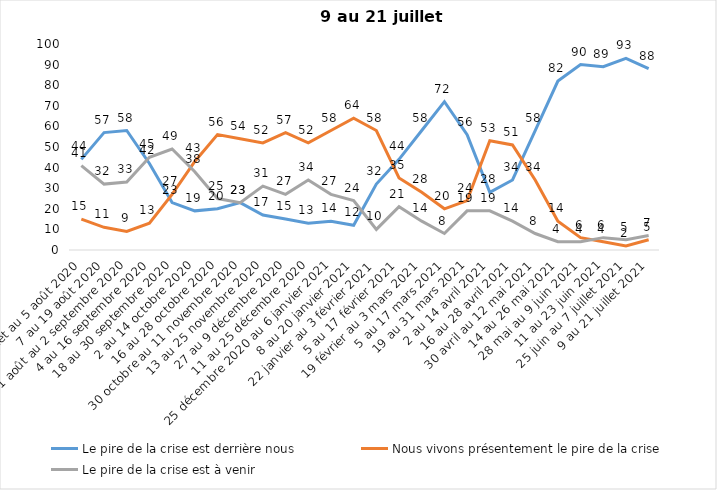
| Category | Le pire de la crise est derrière nous | Nous vivons présentement le pire de la crise | Le pire de la crise est à venir |
|---|---|---|---|
| 24 juillet au 5 août 2020 | 44 | 15 | 41 |
| 7 au 19 août 2020 | 57 | 11 | 32 |
| 21 août au 2 septembre 2020 | 58 | 9 | 33 |
| 4 au 16 septembre 2020 | 42 | 13 | 45 |
| 18 au 30 septembre 2020 | 23 | 27 | 49 |
| 2 au 14 octobre 2020 | 19 | 43 | 38 |
| 16 au 28 octobre 2020 | 20 | 56 | 25 |
| 30 octobre au 11 novembre 2020 | 23 | 54 | 23 |
| 13 au 25 novembre 2020 | 17 | 52 | 31 |
| 27 au 9 décembre 2020 | 15 | 57 | 27 |
| 11 au 25 décembre 2020 | 13 | 52 | 34 |
| 25 décembre 2020 au 6 janvier 2021 | 14 | 58 | 27 |
| 8 au 20 janvier 2021 | 12 | 64 | 24 |
| 22 janvier au 3 février 2021 | 32 | 58 | 10 |
| 5 au 17 février 2021 | 44 | 35 | 21 |
| 19 février au 3 mars 2021 | 58 | 28 | 14 |
| 5 au 17 mars 2021 | 72 | 20 | 8 |
| 19 au 31 mars 2021 | 56 | 24 | 19 |
| 2 au 14 avril 2021 | 28 | 53 | 19 |
| 16 au 28 avril 2021 | 34 | 51 | 14 |
| 30 avril au 12 mai 2021 | 58 | 34 | 8 |
| 14 au 26 mai 2021 | 82 | 14 | 4 |
| 28 mai au 9 juin 2021 | 90 | 6 | 4 |
| 11 au 23 juin 2021 | 89 | 4 | 6 |
| 25 juin au 7 juillet 2021 | 93 | 2 | 5 |
| 9 au 21 juillet 2021 | 88 | 5 | 7 |